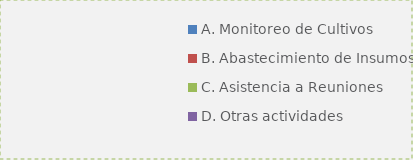
| Category | Series 0 |
|---|---|
| A. Monitoreo de Cultivos | 0 |
| B. Abastecimiento de Insumos | 0 |
| C. Asistencia a Reuniones | 0 |
| D. Otras actividades | 0 |